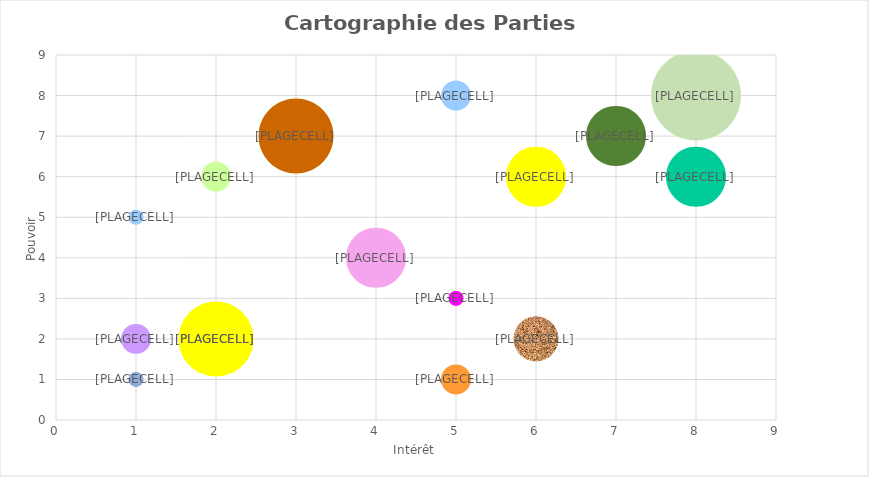
| Category | Series 0 |
|---|---|
| 8.0 | 8 |
| 5.0 | 1 |
| 4.0 | 4 |
| 2.0 | 2 |
| 6.0 | 6 |
| 7.0 | 7 |
| 5.0 | 8 |
| 1.0 | 1 |
| 1.0 | 5 |
| 8.0 | 6 |
| 2.0 | 6 |
| 2.0 | 2 |
| 1.0 | 2 |
| 5.0 | 3 |
| 6.0 | 2 |
| 3.0 | 7 |